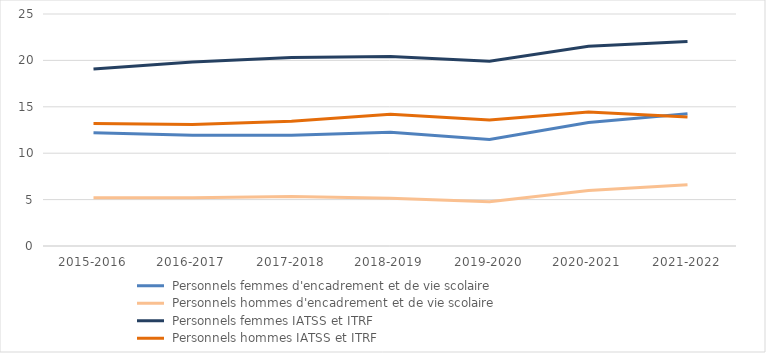
| Category |  Personnels femmes d'encadrement et de vie scolaire |  Personnels hommes d'encadrement et de vie scolaire |  Personnels femmes IATSS et ITRF |  Personnels hommes IATSS et ITRF |
|---|---|---|---|---|
| 2015-2016 | 12.197 | 5.187 | 19.068 | 13.192 |
| 2016-2017 | 11.946 | 5.21 | 19.836 | 13.094 |
| 2017-2018 | 11.941 | 5.331 | 20.313 | 13.43 |
| 2018-2019 | 12.26 | 5.154 | 20.409 | 14.202 |
| 2019-2020 | 11.475 | 4.775 | 19.92 | 13.582 |
| 2020-2021 | 13.317 | 5.976 | 21.52 | 14.438 |
| 2021-2022 | 14.247 | 6.592 | 22.032 | 13.906 |